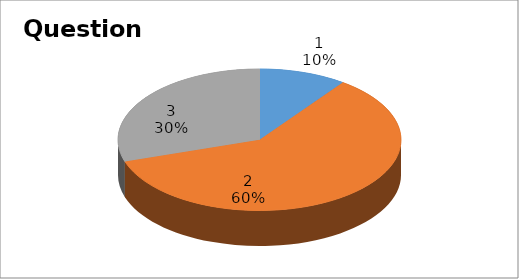
| Category | Series 0 |
|---|---|
| 0 | 2 |
| 1 | 12 |
| 2 | 6 |